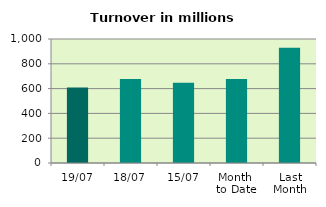
| Category | Series 0 |
|---|---|
| 19/07 | 609.217 |
| 18/07 | 678.242 |
| 15/07 | 647.489 |
| Month 
to Date | 677.466 |
| Last
Month | 929.439 |